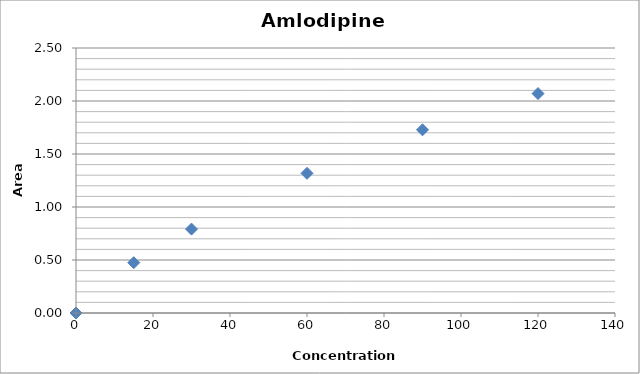
| Category | Series 0 |
|---|---|
| 0.0 | 0 |
| 15.0 | 0.475 |
| 30.0 | 0.792 |
| 60.0 | 1.318 |
| 90.0 | 1.728 |
| 120.0 | 2.07 |